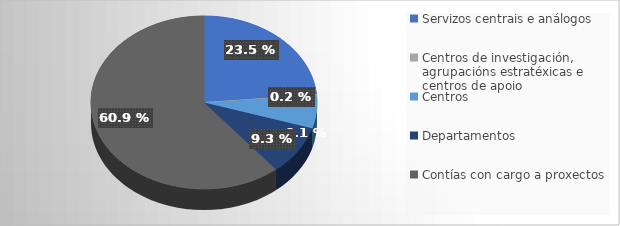
| Category | Series 0 | Series 1 |
|---|---|---|
| Servizos centrais e análogos | 136982 |  |
| Centros de investigación, agrupacións estratéxicas e centros de apoio | 1323.93 |  |
| Centros | 35666.33 |  |
| Departamentos | 54060.52 |  |
| Contías con cargo a proxectos | 355732.16 |  |